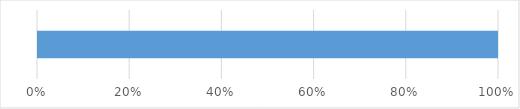
| Category | Series 0 | Series 1 | Series 2 | Series 3 | Series 4 |
|---|---|---|---|---|---|
| 0 | 0 | 0 | 0 | 0 | 17 |